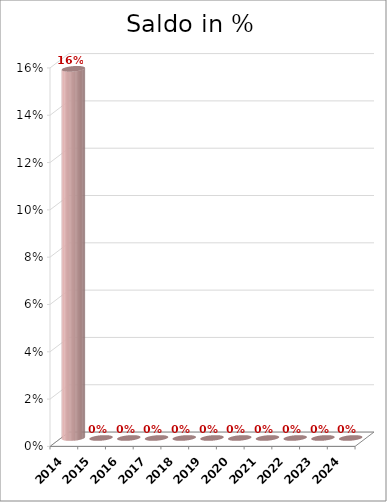
| Category | Saldo in % |
|---|---|
| 2014.0 | 0.156 |
| 2015.0 | 0 |
| 2016.0 | 0 |
| 2017.0 | 0 |
| 2018.0 | 0 |
| 2019.0 | 0 |
| 2020.0 | 0 |
| 2021.0 | 0 |
| 2022.0 | 0 |
| 2023.0 | 0 |
| 2024.0 | 0 |